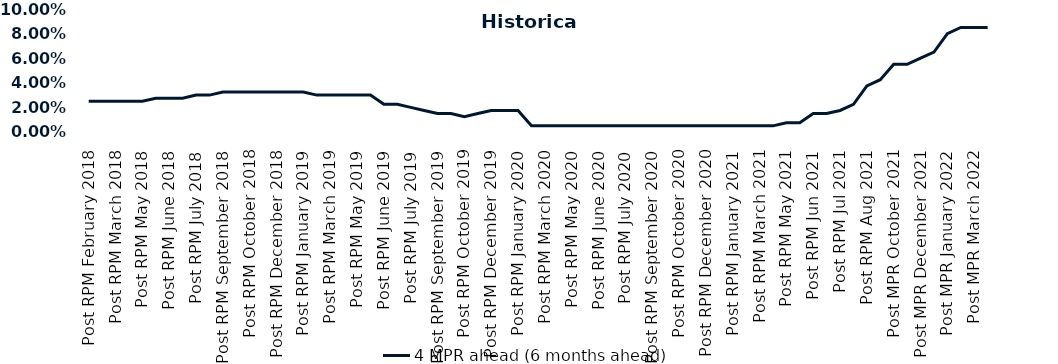
| Category | 4 MPR ahead (6 months ahead) |
|---|---|
| Post RPM February 2018 | 0.025 |
| Pre RPM March 2018 | 0.025 |
| Post RPM March 2018 | 0.025 |
| Pre RPM May 2018 | 0.025 |
| Post RPM May 2018 | 0.025 |
| Pre RPM June 2018 | 0.028 |
| Post RPM June 2018 | 0.028 |
| Pre RPM July 2018 | 0.028 |
| Post RPM July 2018 | 0.03 |
| Pre RPM September 2018 | 0.03 |
| Post RPM September 2018 | 0.032 |
| Pre RPM October 2018 | 0.032 |
| Post RPM October 2018 | 0.032 |
| Pre RPM December 2018 | 0.032 |
| Post RPM December 2018 | 0.032 |
| Pre RPM January 2019 | 0.032 |
| Post RPM January 2019 | 0.032 |
| Pre RPM March 2019 | 0.03 |
| Post RPM March 2019 | 0.03 |
| Pre RPM May 2019 | 0.03 |
| Post RPM May 2019 | 0.03 |
| Pre RPM June 2019 | 0.03 |
| Post RPM June 2019 | 0.022 |
| Pre RPM July 2019 | 0.022 |
| Post RPM July 2019 | 0.02 |
| Pre RPM September 2019 | 0.018 |
| Post RPM September 2019 | 0.015 |
| Pre RPM October 2019 | 0.015 |
| Post RPM October 2019 | 0.012 |
| Pre RPM December 2019 | 0.015 |
| Post RPM December 2019 | 0.018 |
| Pre RPM January 2020 | 0.018 |
| Post RPM January 2020 | 0.018 |
| Pre RPM March 2020 | 0.005 |
| Post RPM March 2020 | 0.005 |
| Pre RPM May 2020 | 0.005 |
| Post RPM May 2020 | 0.005 |
| Pre RPM June 2020 | 0.005 |
| Post RPM June 2020 | 0.005 |
| Pre RPM July 2020 | 0.005 |
| Post RPM July 2020 | 0.005 |
| Pre RPM September 2020 | 0.005 |
| Post RPM September 2020 | 0.005 |
| Pre RPM October 2020 | 0.005 |
| Post RPM October 2020 | 0.005 |
| Pre RPM December 2020 | 0.005 |
|  Post RPM December 2020 | 0.005 |
| Pre RPM January 2021 | 0.005 |
| Post RPM January 2021 | 0.005 |
|  Pre RPM March 2021 | 0.005 |
|  Post RPM March 2021 | 0.005 |
|  Pre RPM May 2021 | 0.005 |
|  Post RPM May 2021 | 0.008 |
|  Pre RPM Jun 2021 | 0.008 |
|   Post RPM Jun 2021 | 0.015 |
| Pre RPM Jul 2021 | 0.015 |
|  Post RPM Jul 2021 | 0.018 |
| Pre RPM Aug 2021 | 0.022 |
|  Post RPM Aug 2021 | 0.038 |
| Pre MPR October 2021 | 0.042 |
| Post MPR October 2021 | 0.055 |
| Pre MPR December 2021 | 0.055 |
| Post MPR December 2021 | 0.06 |
| Pre MPR January 2022 | 0.065 |
| Post MPR January 2022 | 0.08 |
| Pre MPR March 2022 | 0.085 |
| Post MPR March 2022 | 0.085 |
| Pre MPR May 2022 | 0.085 |